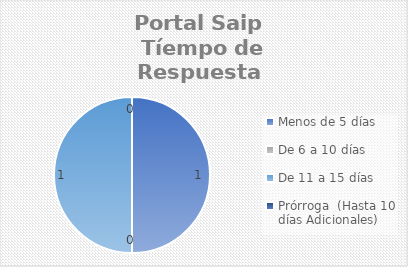
| Category | Series 0 |
|---|---|
| Menos de 5 días | 1 |
| De 6 a 10 días | 0 |
| De 11 a 15 días | 1 |
| Prórroga  (Hasta 10 días Adicionales) | 0 |